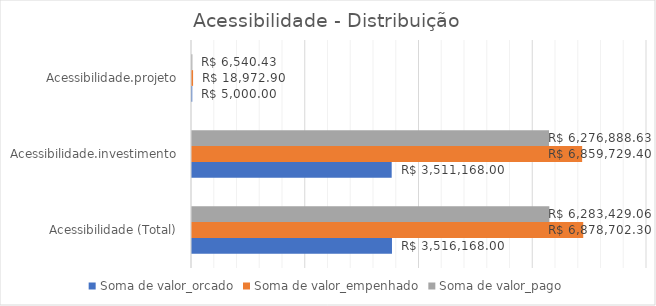
| Category | Soma de valor_orcado | Soma de valor_empenhado | Soma de valor_pago |
|---|---|---|---|
| Acessibilidade (Total) | 3516168 | 6878702.3 | 6283429.06 |
| Acessibilidade.investimento | 3511168 | 6859729.4 | 6276888.63 |
| Acessibilidade.projeto | 5000 | 18972.9 | 6540.43 |